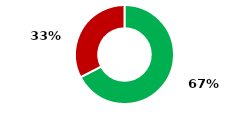
| Category | Series 0 |
|---|---|
| 0 | 0.674 |
| 1 | 0.326 |